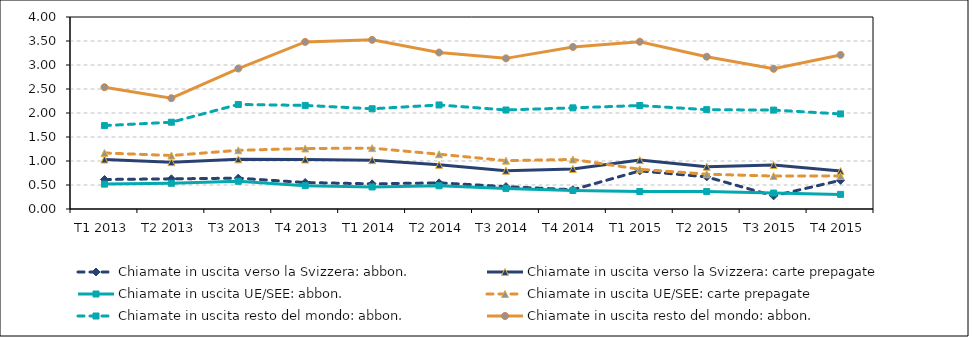
| Category | Chiamate in uscita verso la Svizzera: abbon. | Chiamate in uscita verso la Svizzera: carte prepagate | Chiamate in uscita UE/SEE: abbon. | Chiamate in uscita UE/SEE: carte prepagate | Chiamate in uscita resto del mondo: abbon. |
|---|---|---|---|---|---|
| T1 2013 | 0.615 | 1.031 | 0.518 | 1.167 | 2.537 |
| T2 2013 | 0.628 | 0.976 | 0.536 | 1.114 | 2.308 |
| T3 2013 | 0.643 | 1.034 | 0.577 | 1.223 | 2.926 |
| T4 2013 | 0.552 | 1.031 | 0.486 | 1.26 | 3.48 |
| T1 2014 | 0.524 | 1.018 | 0.459 | 1.268 | 3.524 |
| T2 2014 | 0.545 | 0.92 | 0.483 | 1.141 | 3.26 |
| T3 2014 | 0.467 | 0.798 | 0.429 | 1.007 | 3.138 |
| T4 2014 | 0.401 | 0.834 | 0.386 | 1.032 | 3.376 |
| T1 2015 | 0.794 | 1.018 | 0.365 | 0.827 | 3.485 |
| T2 2015 | 0.669 | 0.881 | 0.364 | 0.725 | 3.172 |
| T3 2015 | 0.274 | 0.914 | 0.332 | 0.686 | 2.921 |
| T4 2015 | 0.598 | 0.79 | 0.304 | 0.69 | 3.21 |